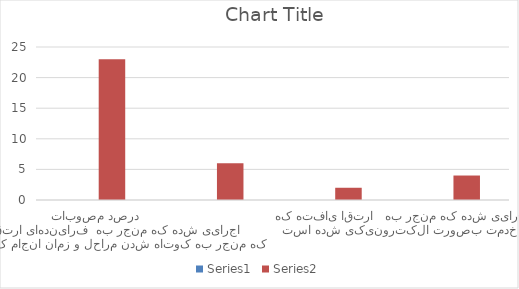
| Category | Series 0 | Series 1 |
|---|---|---|
| درصد مصوبات اجرایی شده که منجر به  فرایندهای ارتقا یافته که منجر به کوتاه شدن مراحل و زمان انجام کار شده است |  | 23 |
| درصد مصوبات اجرایی شده که منجر به  فرایندهای ارتقا یافته که منجر به کاهش هزینه / افزایش درآمد گردیده است |  | 6 |
| درصد مصوبات اجرایی شده که منجر به  فرایندهای ارتقا یافته که منجر به ارتقای کیفی شده است |  | 2 |
| درصد مصوبات اجرایی شده که منجر به   ارتقا یافته که منجر به ارتقای خدمت بصورت الکترونیکی شده است |  | 4 |